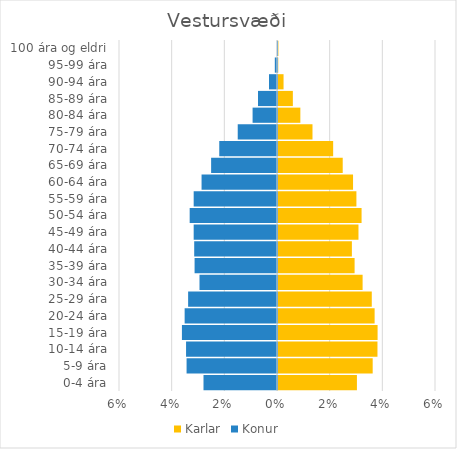
| Category | Karlar | Konur |
|---|---|---|
| 0-4 ára | 0.03 | -0.028 |
| 5-9 ára | 0.036 | -0.034 |
| 10-14 ára | 0.038 | -0.035 |
| 15-19 ára | 0.038 | -0.036 |
| 20-24 ára | 0.037 | -0.035 |
| 25-29 ára | 0.036 | -0.034 |
| 30-34 ára | 0.032 | -0.029 |
| 35-39 ára | 0.029 | -0.031 |
| 40-44 ára | 0.028 | -0.031 |
| 45-49 ára | 0.031 | -0.032 |
| 50-54 ára | 0.032 | -0.033 |
| 55-59 ára | 0.03 | -0.032 |
| 60-64 ára | 0.028 | -0.029 |
| 65-69 ára | 0.025 | -0.025 |
| 70-74 ára | 0.021 | -0.022 |
| 75-79 ára | 0.013 | -0.015 |
| 80-84 ára | 0.008 | -0.009 |
| 85-89 ára | 0.006 | -0.007 |
| 90-94 ára | 0.002 | -0.003 |
| 95-99 ára | 0 | -0.001 |
| 100 ára og eldri | 0 | 0 |